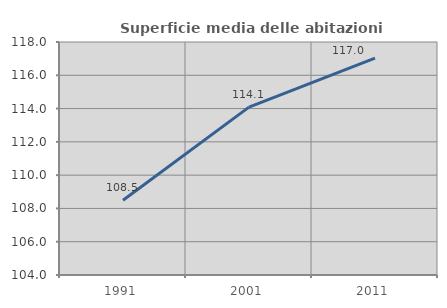
| Category | Superficie media delle abitazioni occupate |
|---|---|
| 1991.0 | 108.49 |
| 2001.0 | 114.086 |
| 2011.0 | 117.03 |